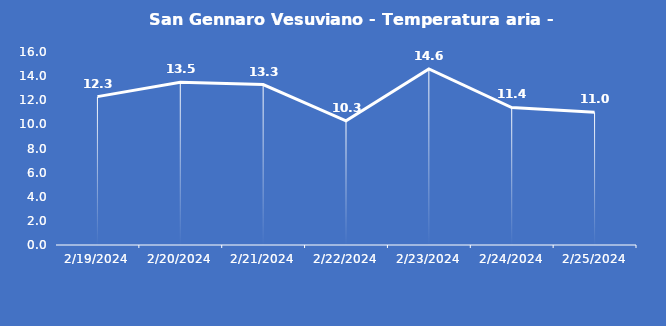
| Category | San Gennaro Vesuviano - Temperatura aria - Grezzo (°C) |
|---|---|
| 2/19/24 | 12.3 |
| 2/20/24 | 13.5 |
| 2/21/24 | 13.3 |
| 2/22/24 | 10.3 |
| 2/23/24 | 14.6 |
| 2/24/24 | 11.4 |
| 2/25/24 | 11 |